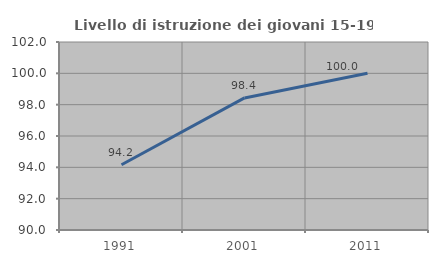
| Category | Livello di istruzione dei giovani 15-19 anni |
|---|---|
| 1991.0 | 94.163 |
| 2001.0 | 98.429 |
| 2011.0 | 100 |